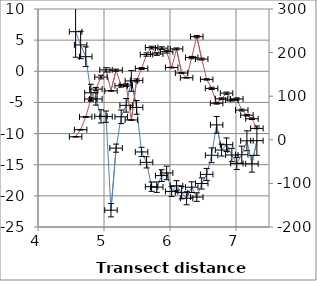
| Category | d34S |
|---|---|
| 4569.934473552123 | 6.356 |
| 4645.862070643036 | 4.231 |
| 4723.276539574883 | 2.343 |
| 4801.685722710534 | -3.446 |
| 4876.685722710534 | -4.436 |
| 4954.33235818175 | -7.235 |
| 5030.817650885642 | -7.278 |
| 5105.817650885642 | -22.301 |
| 5183.135178005953 | -12.34 |
| 5260.452705126264 | -7.307 |
| 5335.452705126264 | -5.466 |
| 5414.680225597373 | -1.545 |
| 5493.907746068481 | -5.801 |
| 5569.445815940566 | -12.949 |
| 5644.445815940566 | -14.618 |
| 5721.100887527513 | -18.524 |
| 5799.510070663164 | -18.604 |
| 5874.510070663164 | -16.748 |
| 5948.941246926877 | -16.318 |
| 6025.177721137061 | -19.288 |
| 6099.4205659101435 | -18.377 |
| 6175.479753389369 | -19.485 |
| 6251.644049486687 | -20.387 |
| 6328.877461945286 | -18.607 |
| 6405.669388604278 | -20.194 |
| 6480.669388604278 | -18.006 |
| 6555.9090058281845 | -16.554 |
| 6630.340182091898 | -13.488 |
| 6706.661869704267 | -8.604 |
| 6781.661869704267 | -12.648 |
| 6856.661869704267 | -11.793 |
| 6937.060874673234 | -13.441 |
| 7012.060874673234 | -14.797 |
| 7087.060874673234 | -13.393 |
| 7165.2209667919105 | -11.164 |
| 7241.385262889229 | -14.847 |
| 7316.385262889229 | -11.139 |